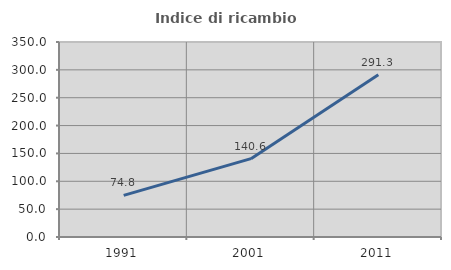
| Category | Indice di ricambio occupazionale  |
|---|---|
| 1991.0 | 74.797 |
| 2001.0 | 140.594 |
| 2011.0 | 291.304 |